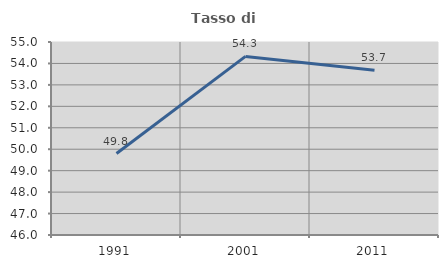
| Category | Tasso di occupazione   |
|---|---|
| 1991.0 | 49.798 |
| 2001.0 | 54.328 |
| 2011.0 | 53.682 |